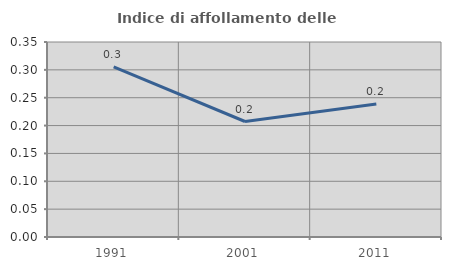
| Category | Indice di affollamento delle abitazioni  |
|---|---|
| 1991.0 | 0.306 |
| 2001.0 | 0.207 |
| 2011.0 | 0.239 |